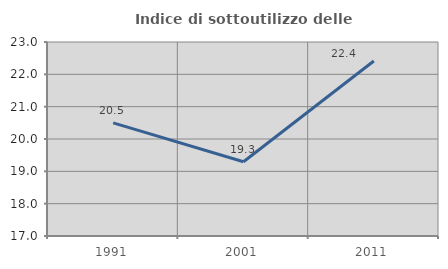
| Category | Indice di sottoutilizzo delle abitazioni  |
|---|---|
| 1991.0 | 20.5 |
| 2001.0 | 19.298 |
| 2011.0 | 22.414 |